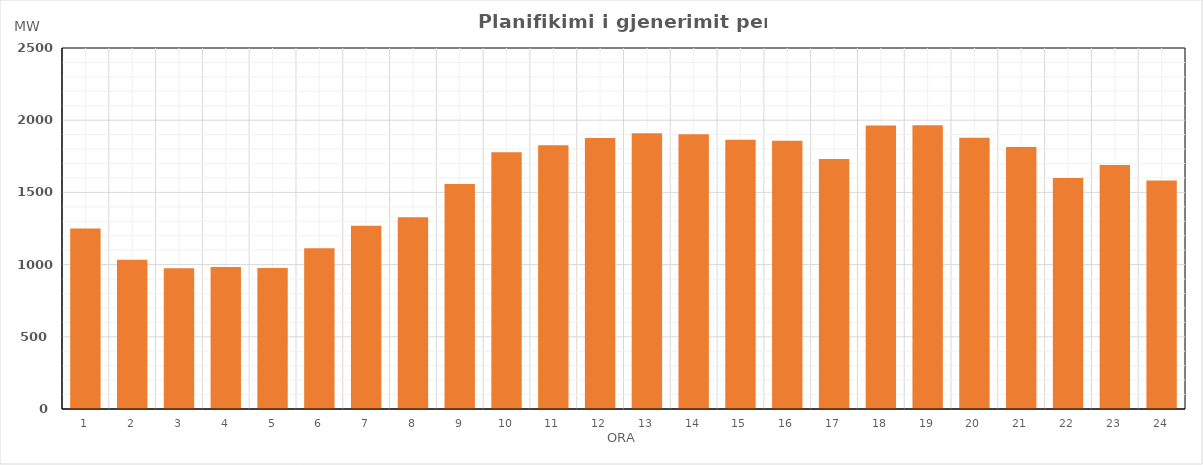
| Category | Max (MW) |
|---|---|
| 0 | 1249.953 |
| 1 | 1033.374 |
| 2 | 973.883 |
| 3 | 983.466 |
| 4 | 976.076 |
| 5 | 1113.254 |
| 6 | 1268.669 |
| 7 | 1327.979 |
| 8 | 1557.611 |
| 9 | 1777.446 |
| 10 | 1826.281 |
| 11 | 1876.583 |
| 12 | 1909.359 |
| 13 | 1902.127 |
| 14 | 1864.476 |
| 15 | 1858.181 |
| 16 | 1731.36 |
| 17 | 1963.626 |
| 18 | 1965.79 |
| 19 | 1879.037 |
| 20 | 1814.646 |
| 21 | 1599.578 |
| 22 | 1690.519 |
| 23 | 1582.945 |